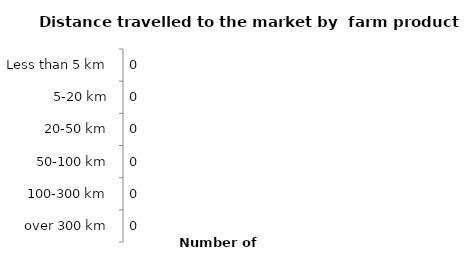
| Category | Series 0 |
|---|---|
| Less than 5 km | 0 |
| 5-20 km | 0 |
| 20-50 km | 0 |
| 50-100 km | 0 |
| 100-300 km | 0 |
| over 300 km | 0 |